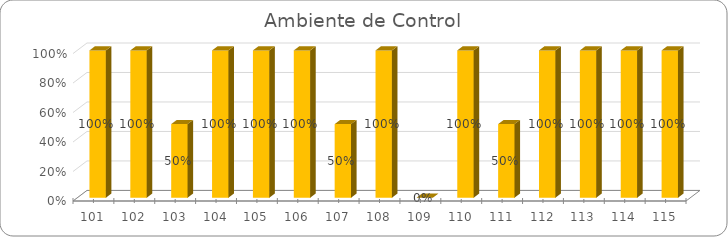
| Category | % Avance |
|---|---|
| 101.0 | 1 |
| 102.0 | 1 |
| 103.0 | 0.5 |
| 104.0 | 1 |
| 105.0 | 1 |
| 106.0 | 1 |
| 107.0 | 0.5 |
| 108.0 | 1 |
| 109.0 | 0 |
| 110.0 | 1 |
| 111.0 | 0.5 |
| 112.0 | 1 |
| 113.0 | 1 |
| 114.0 | 1 |
| 115.0 | 1 |